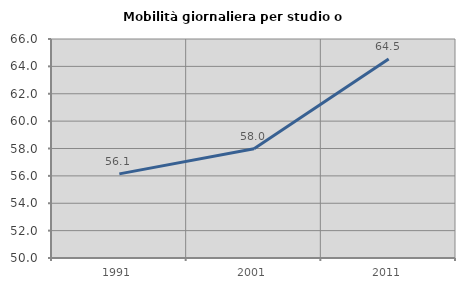
| Category | Mobilità giornaliera per studio o lavoro |
|---|---|
| 1991.0 | 56.144 |
| 2001.0 | 57.984 |
| 2011.0 | 64.547 |